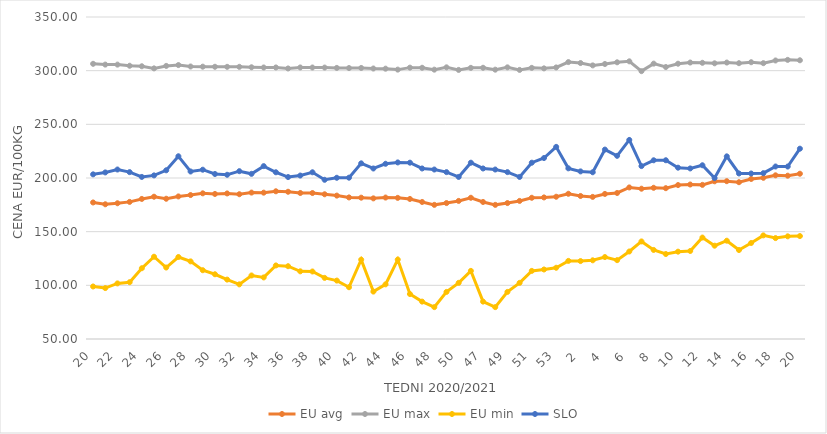
| Category | EU avg | EU max | EU min | SLO |
|---|---|---|---|---|
| 20.0 | 177.204 | 306.38 | 98.928 | 203.41 |
| 21.0 | 175.519 | 305.66 | 97.454 | 205.19 |
| 22.0 | 176.473 | 305.64 | 101.792 | 207.91 |
| 23.0 | 177.741 | 304.59 | 102.918 | 205.46 |
| 24.0 | 180.501 | 304.1 | 115.936 | 201 |
| 25.0 | 182.568 | 302.13 | 126.655 | 202.43 |
| 26.0 | 180.667 | 304.43 | 116.597 | 207.19 |
| 27.0 | 182.833 | 305.22 | 126.397 | 220.25 |
| 28.0 | 184.121 | 303.88 | 122.317 | 206.06 |
| 29.0 | 185.712 | 303.73 | 114.082 | 207.73 |
| 30.0 | 185.141 | 303.63 | 110.314 | 203.73 |
| 31.0 | 185.621 | 303.57 | 105.336 | 203 |
| 32.0 | 184.887 | 303.58 | 100.908 | 206.36 |
| 33.0 | 186.411 | 303.17 | 109.191 | 203.88 |
| 34.0 | 186.338 | 302.96 | 107.355 | 211.07 |
| 35.0 | 187.628 | 302.99 | 118.534 | 205.34 |
| 36.0 | 187.19 | 302.05 | 117.814 | 200.88 |
| 37.0 | 186.038 | 302.98 | 113.058 | 202.29 |
| 38.0 | 185.986 | 302.94 | 112.896 | 205.33 |
| 39.0 | 184.836 | 302.88 | 106.953 | 198.33 |
| 40.0 | 183.595 | 302.56 | 104.426 | 200.21 |
| 41.0 | 181.893 | 302.44 | 98.23 | 200.3 |
| 42.0 | 181.671 | 302.52 | 123.908 | 213.66 |
| 43.0 | 181.023 | 302.01 | 94.177 | 208.86 |
| 44.0 | 181.795 | 301.86 | 100.908 | 213.25 |
| 45.0 | 181.489 | 300.98 | 124 | 214.51 |
| 46.0 | 180.473 | 302.82 | 91.889 | 214.27 |
| 47.0 | 177.656 | 302.7 | 84.832 | 208.87 |
| 48.0 | 174.977 | 300.94 | 79.697 | 207.9 |
| 49.0 | 176.65 | 303.09 | 93.873 | 205.48 |
| 50.0 | 178.648 | 300.7 | 102.316 | 200.99 |
| 51.0 | 181.58 | 302.62 | 113.46 | 214.25 |
| 47.0 | 177.656 | 302.7 | 84.832 | 208.87 |
| 48.0 | 174.977 | 300.94 | 79.697 | 207.9 |
| 49.0 | 176.65 | 303.09 | 93.873 | 205.48 |
| 50.0 | 178.648 | 300.7 | 102.316 | 200.99 |
| 51.0 | 181.58 | 302.62 | 113.46 | 214.25 |
| 52.0 | 181.9 | 302.14 | 114.76 | 218.61 |
| 53.0 | 182.536 | 303 | 116.375 | 229 |
| 1.0 | 185.3 | 308 | 122.769 | 209 |
| 2.0 | 183.25 | 307.1 | 122.609 | 206.15 |
| 3.0 | 182.393 | 304.91 | 123.32 | 205.35 |
| 4.0 | 185.158 | 306.22 | 126.329 | 226.48 |
| 5.0 | 186.04 | 307.79 | 123.461 | 220.65 |
| 6.0 | 191.206 | 308.7 | 131.528 | 235.46 |
| 7.0 | 190.028 | 299.55 | 140.902 | 211.1 |
| 8.0 | 190.875 | 306.55 | 132.97 | 216.51 |
| 9.0 | 190.519 | 303.4 | 129.173 | 216.54 |
| 10.0 | 193.416 | 306.48 | 131.374 | 209.61 |
| 11.0 | 193.936 | 307.58 | 132.024 | 208.91 |
| 12.0 | 193.599 | 307.33 | 144.506 | 211.87 |
| 13.0 | 196.932 | 306.85 | 136.936 | 199.93 |
| 14.0 | 197.044 | 307.56 | 141.574 | 220.15 |
| 15.0 | 196.085 | 306.96 | 132.893 | 204.2 |
| 16.0 | 199.1 | 307.87 | 139.462 | 204.2 |
| 17.0 | 200.192 | 306.98 | 146.538 | 204.51 |
| 18.0 | 202.508 | 309.49 | 144.017 | 210.72 |
| 19.0 | 202.15 | 310.06 | 145.644 | 210.68 |
| 20.0 | 203.975 | 309.69 | 145.911 | 227.32 |